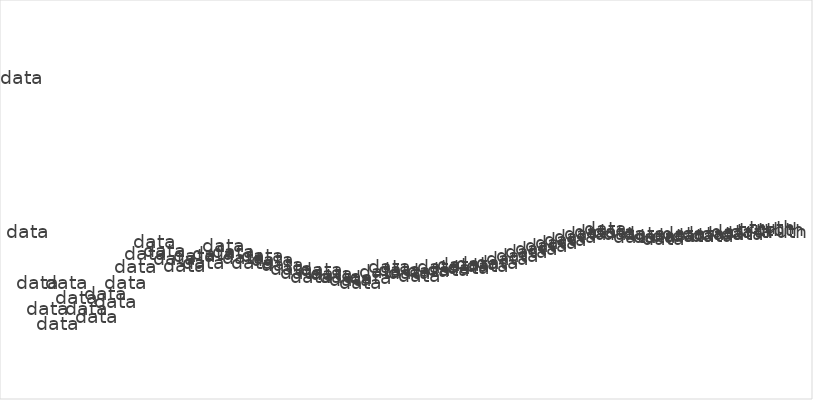
| Category | Series 0 |
|---|---|
| 0 | 1 |
| 1 | 0.5 |
| 2 | 0.333 |
| 3 | 0.25 |
| 4 | 0.2 |
| 5 | 0.333 |
| 6 | 0.286 |
| 7 | 0.25 |
| 8 | 0.222 |
| 9 | 0.3 |
| 10 | 0.273 |
| 11 | 0.333 |
| 12 | 0.385 |
| 13 | 0.429 |
| 14 | 0.467 |
| 15 | 0.438 |
| 16 | 0.412 |
| 17 | 0.389 |
| 18 | 0.421 |
| 19 | 0.4 |
| 20 | 0.429 |
| 21 | 0.455 |
| 22 | 0.435 |
| 23 | 0.417 |
| 24 | 0.4 |
| 25 | 0.423 |
| 26 | 0.407 |
| 27 | 0.393 |
| 28 | 0.379 |
| 29 | 0.367 |
| 30 | 0.355 |
| 31 | 0.375 |
| 32 | 0.364 |
| 33 | 0.353 |
| 34 | 0.343 |
| 35 | 0.333 |
| 36 | 0.351 |
| 37 | 0.368 |
| 38 | 0.385 |
| 39 | 0.375 |
| 40 | 0.366 |
| 41 | 0.357 |
| 42 | 0.372 |
| 43 | 0.386 |
| 44 | 0.378 |
| 45 | 0.391 |
| 46 | 0.383 |
| 47 | 0.396 |
| 48 | 0.388 |
| 49 | 0.4 |
| 50 | 0.412 |
| 51 | 0.423 |
| 52 | 0.434 |
| 53 | 0.444 |
| 54 | 0.455 |
| 55 | 0.464 |
| 56 | 0.474 |
| 57 | 0.483 |
| 58 | 0.492 |
| 59 | 0.5 |
| 60 | 0.508 |
| 61 | 0.5 |
| 62 | 0.492 |
| 63 | 0.484 |
| 64 | 0.492 |
| 65 | 0.485 |
| 66 | 0.478 |
| 67 | 0.485 |
| 68 | 0.493 |
| 69 | 0.486 |
| 70 | 0.493 |
| 71 | 0.486 |
| 72 | 0.493 |
| 73 | 0.5 |
| 74 | 0.493 |
| 75 | 0.5 |
| 76 | 0.506 |
| 77 | 0.513 |
| 78 | 0.506 |
| 79 | 0.5 |